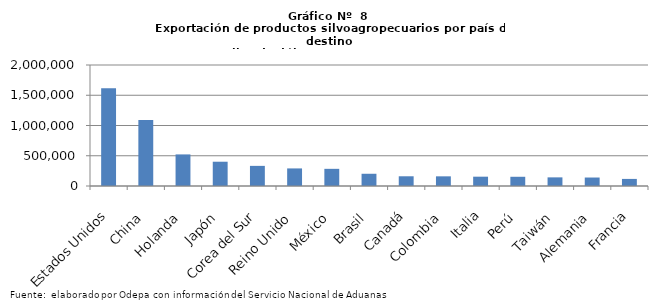
| Category | Series 0 |
|---|---|
| Estados Unidos | 1615348.237 |
| China | 1089474.559 |
| Holanda | 522055.499 |
| Japón | 401321.449 |
| Corea del Sur | 332676.253 |
| Reino Unido | 290639.277 |
| México | 283731.788 |
| Brasil | 202207.231 |
| Canadá | 160731.138 |
| Colombia | 159836.323 |
| Italia | 154055.37 |
| Perú | 152431.246 |
| Taiwán | 142696.831 |
| Alemania | 140084.553 |
| Francia | 117107.577 |